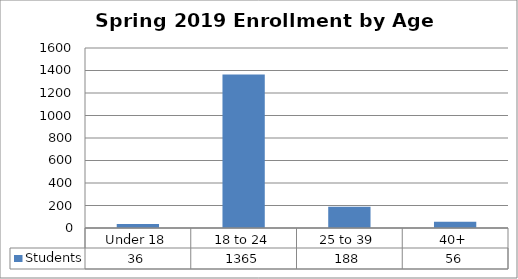
| Category | Students |
|---|---|
| Under 18 | 36 |
| 18 to 24 | 1365 |
| 25 to 39 | 188 |
| 40+ | 56 |